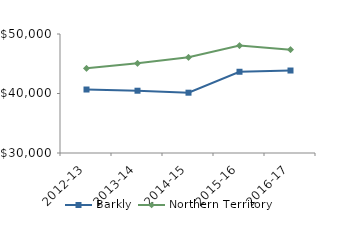
| Category | Barkly | Northern Territory |
|---|---|---|
| 2012-13 | 40669.77 | 44232.02 |
| 2013-14 | 40468 | 45075.51 |
| 2014-15 | 40135.74 | 46083.65 |
| 2015-16 | 43653.95 | 48046.27 |
| 2016-17 | 43862.32 | 47367.05 |